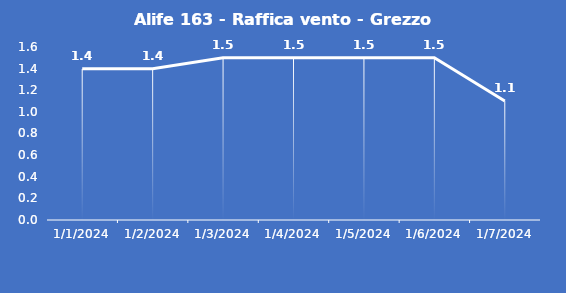
| Category | Alife 163 - Raffica vento - Grezzo (m/s) |
|---|---|
| 1/1/24 | 1.4 |
| 1/2/24 | 1.4 |
| 1/3/24 | 1.5 |
| 1/4/24 | 1.5 |
| 1/5/24 | 1.5 |
| 1/6/24 | 1.5 |
| 1/7/24 | 1.1 |